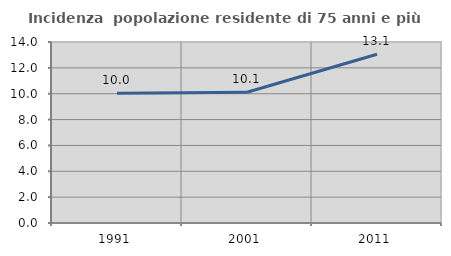
| Category | Incidenza  popolazione residente di 75 anni e più |
|---|---|
| 1991.0 | 10.029 |
| 2001.0 | 10.116 |
| 2011.0 | 13.056 |